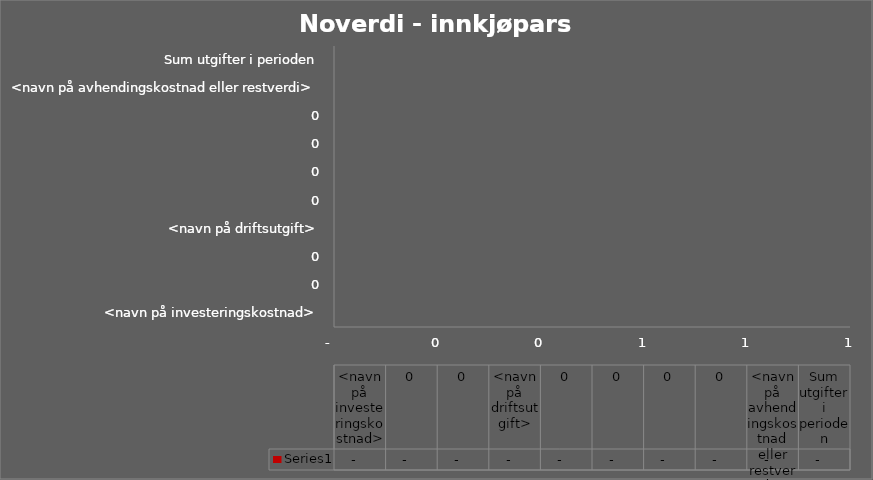
| Category | Series 0 |
|---|---|
| <navn på investeringskostnad> | 0 |
| 0,00 | 0 |
| 0,00 | 0 |
| <navn på driftsutgift> | 0 |
| 0,00 | 0 |
| 0,00 | 0 |
| 0,00 | 0 |
| 0,00 | 0 |
| <navn på avhendingskostnad eller restverdi> | 0 |
| Sum utgifter i perioden | 0 |